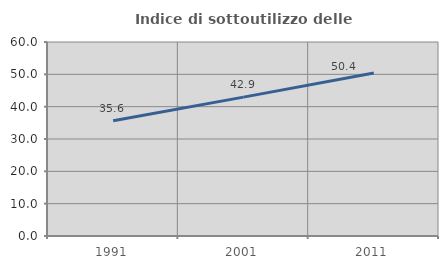
| Category | Indice di sottoutilizzo delle abitazioni  |
|---|---|
| 1991.0 | 35.628 |
| 2001.0 | 42.946 |
| 2011.0 | 50.411 |